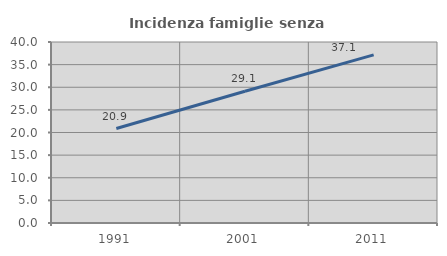
| Category | Incidenza famiglie senza nuclei |
|---|---|
| 1991.0 | 20.879 |
| 2001.0 | 29.13 |
| 2011.0 | 37.143 |